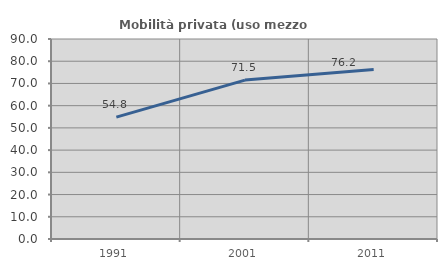
| Category | Mobilità privata (uso mezzo privato) |
|---|---|
| 1991.0 | 54.823 |
| 2001.0 | 71.513 |
| 2011.0 | 76.227 |